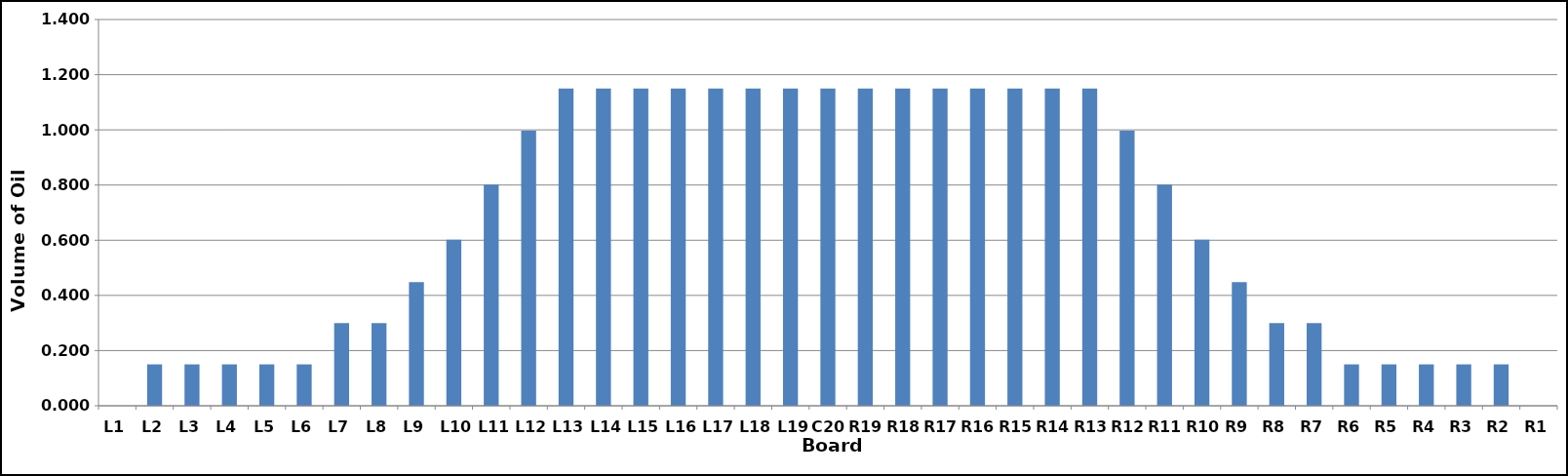
| Category | Series 0 |
|---|---|
| L1 | 0 |
| L2 | 0.15 |
| L3 | 0.15 |
| L4 | 0.15 |
| L5 | 0.15 |
| L6 | 0.15 |
| L7 | 0.3 |
| L8 | 0.3 |
| L9 | 0.448 |
| L10 | 0.602 |
| L11 | 0.802 |
| L12 | 0.997 |
| L13 | 1.15 |
| L14 | 1.15 |
| L15 | 1.15 |
| L16 | 1.15 |
| L17 | 1.15 |
| L18 | 1.15 |
| L19 | 1.15 |
| C20 | 1.15 |
| R19 | 1.15 |
| R18 | 1.15 |
| R17 | 1.15 |
| R16 | 1.15 |
| R15 | 1.15 |
| R14 | 1.15 |
| R13 | 1.15 |
| R12 | 0.997 |
| R11 | 0.802 |
| R10 | 0.602 |
| R9 | 0.448 |
| R8 | 0.3 |
| R7 | 0.3 |
| R6 | 0.15 |
| R5 | 0.15 |
| R4 | 0.15 |
| R3 | 0.15 |
| R2 | 0.15 |
| R1 | 0 |